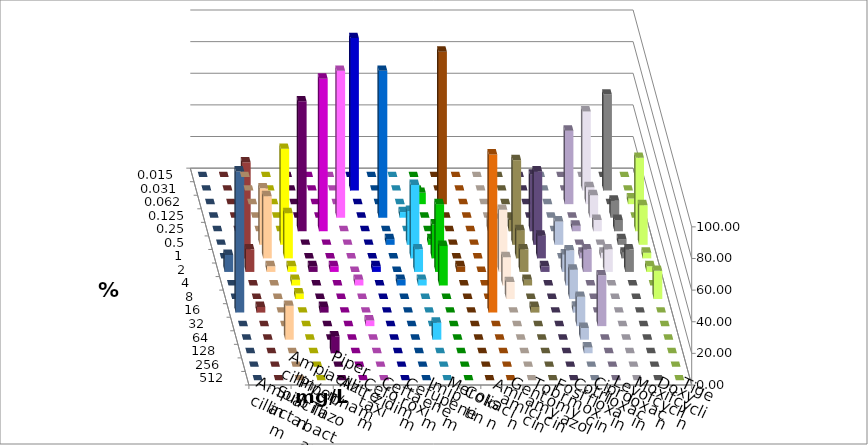
| Category | Ampicillin | Ampicillin/ Sulbactam | Piperacillin | Piperacillin/ Tazobactam | Aztreonam | Cefotaxim | Ceftazidim | Cefuroxim | Imipenem | Meropenem | Colistin | Amikacin | Gentamicin | Tobramycin | Fosfomycin | Cotrimoxazol | Ciprofloxacin | Levofloxacin | Moxifloxacin | Doxycyclin | Tigecyclin |
|---|---|---|---|---|---|---|---|---|---|---|---|---|---|---|---|---|---|---|---|---|---|
| 0.015 | 0 | 0 | 0 | 0 | 0 | 0 | 0 | 0 | 0 | 0 | 0 | 0 | 0 | 0 | 0 | 0 | 0 | 0 | 0 | 0 | 0 |
| 0.031 | 0 | 0 | 0 | 0 | 0 | 96.429 | 0 | 0 | 0 | 0 | 0 | 0 | 0 | 0 | 0 | 0 | 50 | 60.714 | 0 | 0 | 0 |
| 0.062 | 0 | 0 | 0 | 0 | 0 | 0 | 0 | 0 | 7.143 | 96.429 | 0 | 0 | 0 | 0 | 0 | 46.429 | 10.714 | 0 | 3.571 | 0 | 0 |
| 0.125 | 0 | 0 | 0 | 0 | 92.857 | 0 | 92.857 | 3.571 | 0 | 0 | 0 | 0 | 0 | 0 | 0 | 0 | 14.286 | 10.714 | 0 | 0 | 0 |
| 0.25 | 0 | 0 | 82.143 | 96.429 | 0 | 0 | 0 | 0 | 0 | 0 | 0 | 7.143 | 7.143 | 35.714 | 0 | 3.571 | 7.143 | 7.143 | 46.429 | 0 | 0 |
| 0.5 | 35.714 | 60.714 | 0 | 0 | 0 | 0 | 3.571 | 21.429 | 3.571 | 0 | 0 | 0 | 53.571 | 46.429 | 14.815 | 0 | 0 | 3.571 | 25 | 0 | 21.429 |
| 1.0 | 39.286 | 28.571 | 0 | 0 | 0 | 0 | 0 | 46.429 | 21.429 | 0 | 0 | 25 | 17.857 | 14.286 | 0 | 3.571 | 3.571 | 3.571 | 3.571 | 0 | 60.714 |
| 2.0 | 3.571 | 3.571 | 3.571 | 3.571 | 0 | 3.571 | 0 | 14.286 | 42.857 | 3.571 | 0 | 39.286 | 14.286 | 3.571 | 11.111 | 14.286 | 14.286 | 14.286 | 3.571 | 10.714 | 14.286 |
| 4.0 | 0 | 3.571 | 0 | 0 | 3.571 | 0 | 3.571 | 3.571 | 25 | 0 | 0 | 17.857 | 3.571 | 0 | 22.222 | 0 | 0 | 0 | 0 | 0 | 0 |
| 8.0 | 0 | 3.571 | 0 | 0 | 0 | 0 | 0 | 0 | 0 | 0 | 0 | 10.714 | 0 | 0 | 18.519 | 0 | 0 | 0 | 17.857 | 0 | 0 |
| 16.0 | 0 | 0 | 3.571 | 0 | 0 | 0 | 0 | 0 | 0 | 0 | 100 | 0 | 3.571 | 0 | 3.704 | 0 | 0 | 0 | 0 | 89.286 | 3.571 |
| 32.0 | 0 | 0 | 0 | 0 | 3.571 | 0 | 0 | 0 | 0 | 0 | 0 | 0 | 0 | 0 | 18.519 | 32.143 | 0 | 0 | 0 | 0 | 0 |
| 64.0 | 21.429 | 0 | 0 | 0 | 0 | 0 | 0 | 10.714 | 0 | 0 | 0 | 0 | 0 | 0 | 7.407 | 0 | 0 | 0 | 0 | 0 | 0 |
| 128.0 | 0 | 0 | 10.714 | 0 | 0 | 0 | 0 | 0 | 0 | 0 | 0 | 0 | 0 | 0 | 3.704 | 0 | 0 | 0 | 0 | 0 | 0 |
| 256.0 | 0 | 0 | 0 | 0 | 0 | 0 | 0 | 0 | 0 | 0 | 0 | 0 | 0 | 0 | 0 | 0 | 0 | 0 | 0 | 0 | 0 |
| 512.0 | 0 | 0 | 0 | 0 | 0 | 0 | 0 | 0 | 0 | 0 | 0 | 0 | 0 | 0 | 0 | 0 | 0 | 0 | 0 | 0 | 0 |